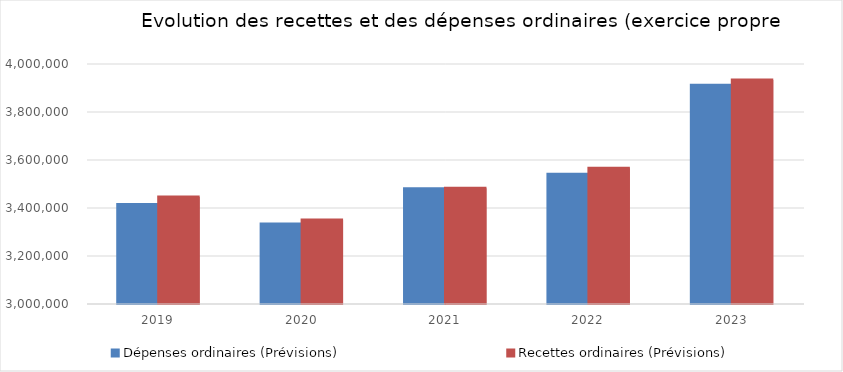
| Category | Dépenses ordinaires (Prévisions) | Recettes ordinaires (Prévisions) |
|---|---|---|
| 2019.0 | 3414583.8 | 3445914.2 |
| 2020.0 | 3333650.56 | 3350038.46 |
| 2021.0 | 3480005.01 | 3482155.75 |
| 2022.0 | 3540353.46 | 3565667.76 |
| 2023.0 | 3911463.76 | 3933707.72 |